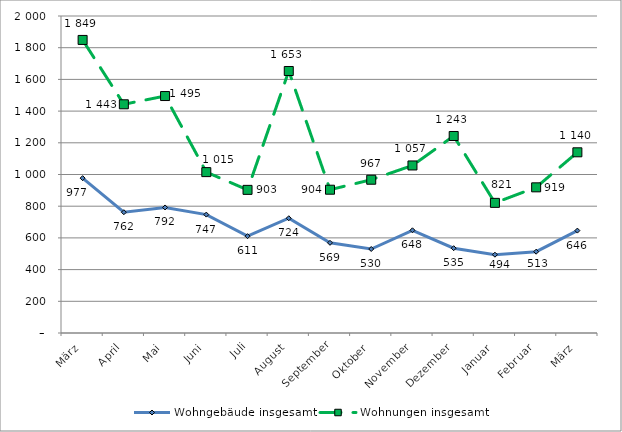
| Category | Wohngebäude insgesamt | Wohnungen insgesamt |
|---|---|---|
| März | 977 | 1849 |
| April | 762 | 1443 |
| Mai | 792 | 1495 |
| Juni | 747 | 1015 |
| Juli | 611 | 903 |
| August | 724 | 1653 |
| September | 569 | 904 |
| Oktober | 530 | 967 |
| November | 648 | 1057 |
| Dezember | 535 | 1243 |
| Januar | 494 | 821 |
| Februar | 513 | 919 |
| März | 646 | 1140 |